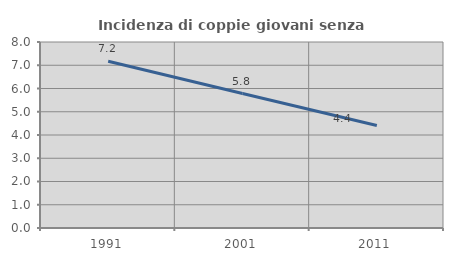
| Category | Incidenza di coppie giovani senza figli |
|---|---|
| 1991.0 | 7.173 |
| 2001.0 | 5.782 |
| 2011.0 | 4.408 |